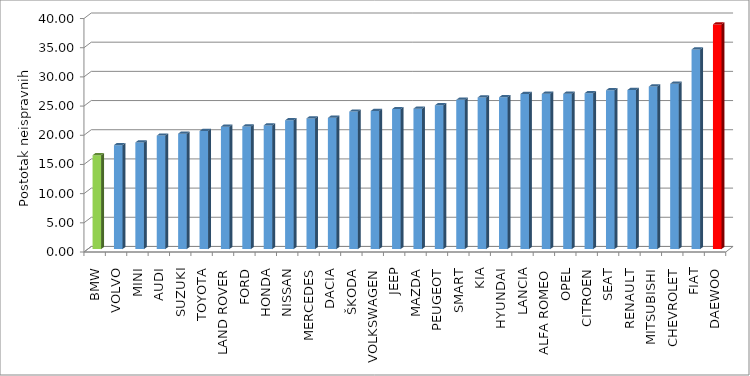
| Category | Series 4 |
|---|---|
| BMW | 16.09 |
| VOLVO | 17.815 |
| MINI | 18.274 |
| AUDI | 19.445 |
| SUZUKI | 19.78 |
| TOYOTA | 20.224 |
| LAND ROVER | 20.983 |
| FORD | 21.004 |
| HONDA | 21.199 |
| NISSAN | 22.069 |
| MERCEDES | 22.394 |
| DACIA | 22.491 |
| ŠKODA | 23.558 |
| VOLKSWAGEN | 23.661 |
| JEEP | 23.984 |
| MAZDA | 24.06 |
| PEUGEOT | 24.64 |
| SMART | 25.578 |
| KIA | 25.981 |
| HYUNDAI | 26.008 |
| LANCIA | 26.57 |
| ALFA ROMEO | 26.604 |
| OPEL | 26.615 |
| CITROEN | 26.716 |
| SEAT | 27.216 |
| RENAULT | 27.25 |
| MITSUBISHI | 27.85 |
| CHEVROLET | 28.338 |
| FIAT | 34.206 |
| DAEWOO | 38.503 |